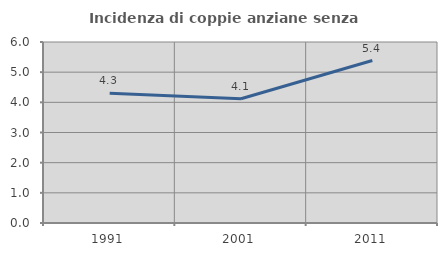
| Category | Incidenza di coppie anziane senza figli  |
|---|---|
| 1991.0 | 4.301 |
| 2001.0 | 4.118 |
| 2011.0 | 5.385 |